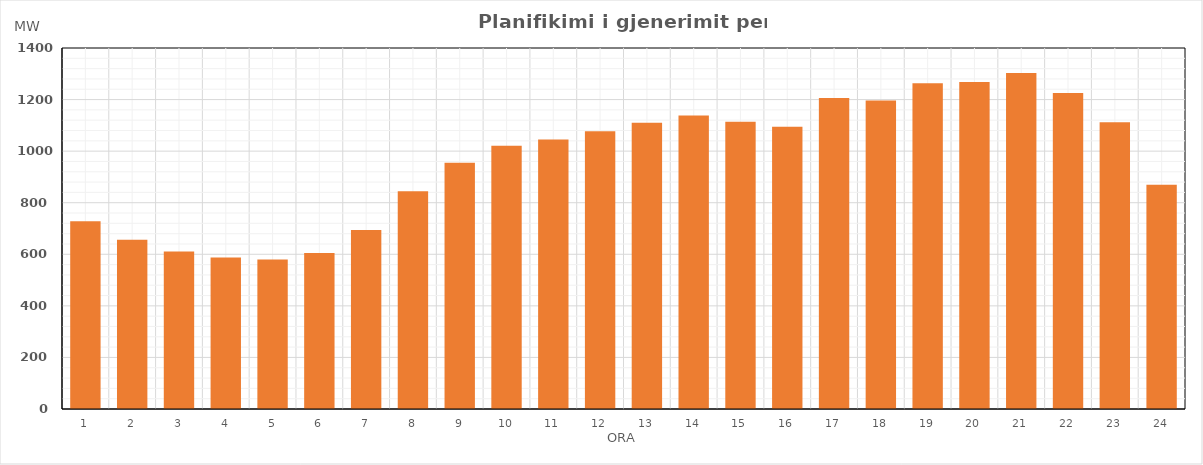
| Category | Max (MW) |
|---|---|
| 0 | 727.76 |
| 1 | 656.47 |
| 2 | 611.12 |
| 3 | 587.78 |
| 4 | 579.96 |
| 5 | 604.63 |
| 6 | 694.62 |
| 7 | 844.51 |
| 8 | 954.81 |
| 9 | 1020.55 |
| 10 | 1045.36 |
| 11 | 1077.56 |
| 12 | 1109.85 |
| 13 | 1138.05 |
| 14 | 1113.86 |
| 15 | 1094.35 |
| 16 | 1205.96 |
| 17 | 1196.64 |
| 18 | 1262.87 |
| 19 | 1268.17 |
| 20 | 1303.52 |
| 21 | 1225.09 |
| 22 | 1111.7 |
| 23 | 869.53 |